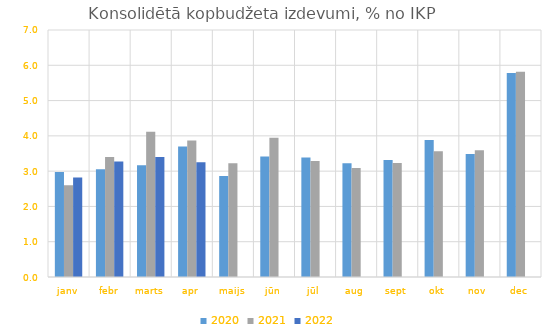
| Category | 2020 | 2021 | 2022 |
|---|---|---|---|
| janv | 2.976 | 2.599 | 2.819 |
| febr | 3.051 | 3.403 | 3.272 |
| marts | 3.169 | 4.119 | 3.401 |
| apr | 3.697 | 3.869 | 3.251 |
| maijs | 2.865 | 3.222 | 0 |
| jūn | 3.414 | 3.949 | 0 |
| jūl | 3.388 | 3.287 | 0 |
| aug | 3.226 | 3.091 | 0 |
| sept | 3.317 | 3.234 | 0 |
| okt | 3.883 | 3.566 | 0 |
| nov | 3.485 | 3.591 | 0 |
| dec | 5.782 | 5.819 | 0 |